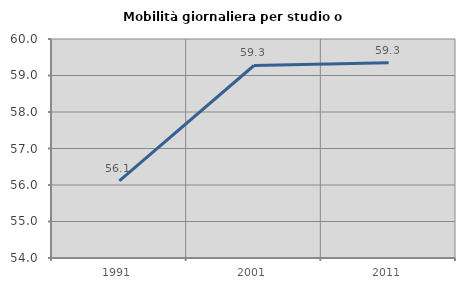
| Category | Mobilità giornaliera per studio o lavoro |
|---|---|
| 1991.0 | 56.115 |
| 2001.0 | 59.274 |
| 2011.0 | 59.35 |